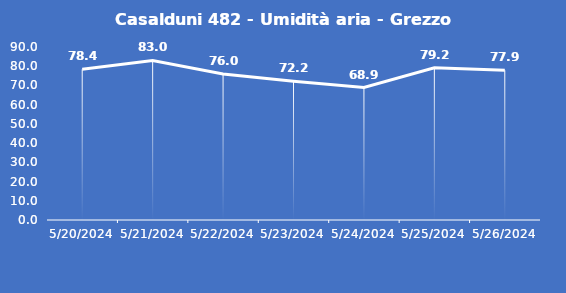
| Category | Casalduni 482 - Umidità aria - Grezzo (%) |
|---|---|
| 5/20/24 | 78.4 |
| 5/21/24 | 83 |
| 5/22/24 | 76 |
| 5/23/24 | 72.2 |
| 5/24/24 | 68.9 |
| 5/25/24 | 79.2 |
| 5/26/24 | 77.9 |